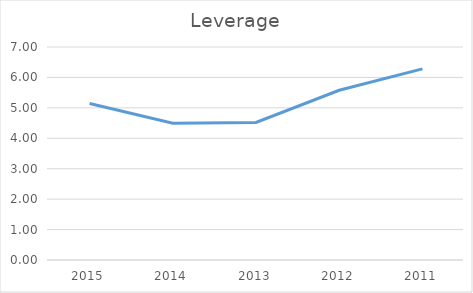
| Category | Leverage |
|---|---|
| 2015.0 | 5.146 |
| 2014.0 | 4.498 |
| 2013.0 | 4.521 |
| 2012.0 | 5.578 |
| 2011.0 | 6.282 |